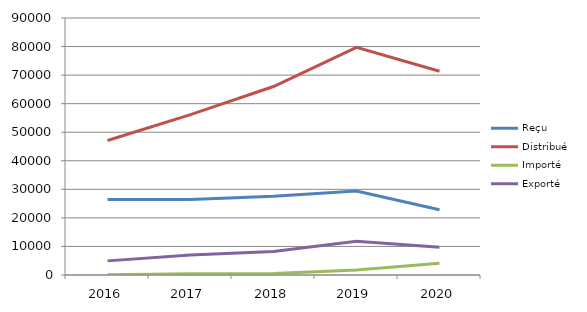
| Category | Reçu | Distribué | Importé | Exporté |
|---|---|---|---|---|
| 2016.0 | 26458 | 47106 | 126 | 4947 |
| 2017.0 | 26479 | 56155 | 433 | 7036 |
| 2018.0 | 27551 | 65999 | 498 | 8190 |
| 2019.0 | 29434 | 79730 | 1754 | 11792 |
| 2020.0 | 22870 | 71357 | 4130 | 9679 |